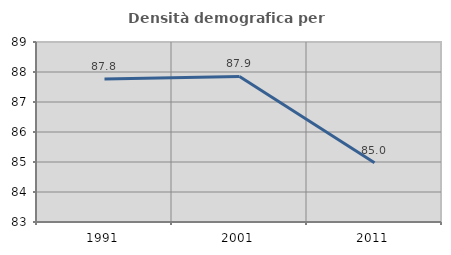
| Category | Densità demografica |
|---|---|
| 1991.0 | 87.77 |
| 2001.0 | 87.851 |
| 2011.0 | 84.976 |